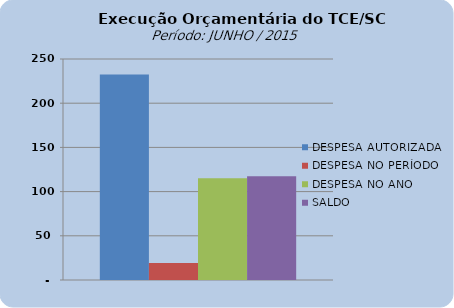
| Category | DESPESA AUTORIZADA | DESPESA NO PERÍODO | DESPESA NO ANO | SALDO |
|---|---|---|---|---|
| 0 | 232376629.63 | 19125951.25 | 114967962.72 | 117408666.91 |